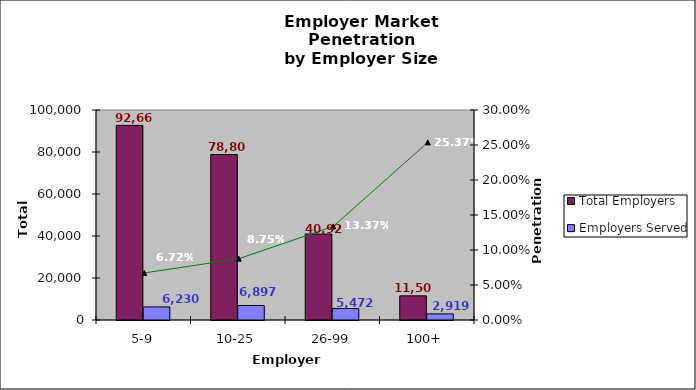
| Category | Total Employers | Employers Served |
|---|---|---|
| 5-9 | 92664 | 6230 |
| 10-25 | 78807 | 6897 |
| 26-99 | 40923 | 5472 |
| 100+ | 11506 | 2919 |